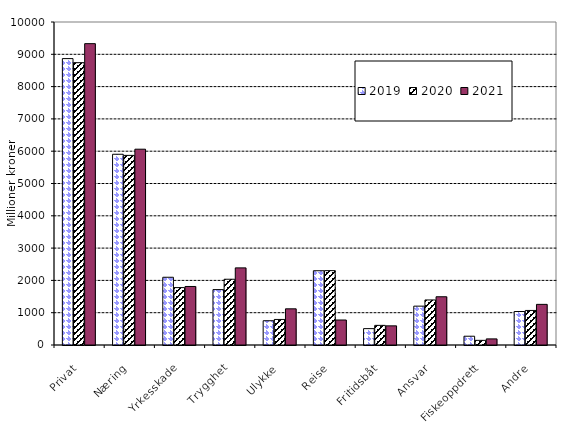
| Category | 2019 | 2020 | 2021 |
|---|---|---|---|
| Privat | 8866.897 | 8740.354 | 9329.626 |
| Næring | 5905.407 | 5870.536 | 6062.059 |
| Yrkesskade | 2097.287 | 1776.833 | 1811.924 |
| Trygghet | 1715.016 | 2036.022 | 2387.385 |
| Ulykke | 750.931 | 790.996 | 1120.298 |
| Reise | 2298.928 | 2302.566 | 773.788 |
| Fritidsbåt | 506.539 | 607.819 | 593.006 |
| Ansvar | 1202.794 | 1394.395 | 1493.658 |
| Fiskeoppdrett | 271.743 | 143.741 | 189.004 |
| Andre | 1036.461 | 1069.674 | 1258.06 |